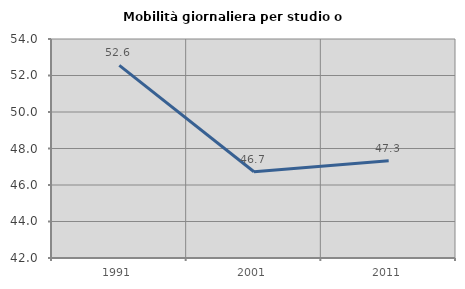
| Category | Mobilità giornaliera per studio o lavoro |
|---|---|
| 1991.0 | 52.555 |
| 2001.0 | 46.724 |
| 2011.0 | 47.324 |